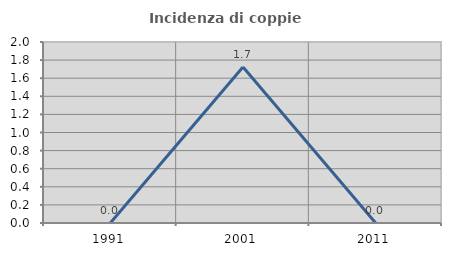
| Category | Incidenza di coppie miste |
|---|---|
| 1991.0 | 0 |
| 2001.0 | 1.724 |
| 2011.0 | 0 |